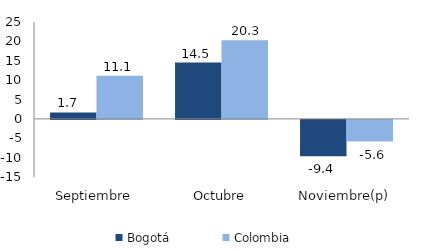
| Category | Bogotá | Colombia |
|---|---|---|
| Septiembre | 1.666 | 11.108 |
| Octubre | 14.54 | 20.315 |
| Noviembre(p) | -9.401 | -5.596 |